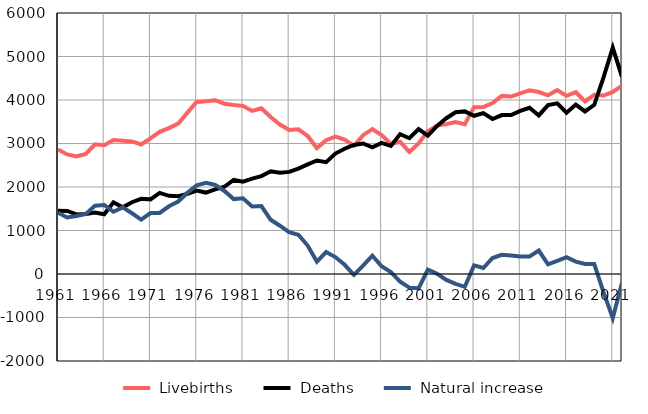
| Category |  Livebirths |  Deaths |  Natural increase |
|---|---|---|---|
| 1961.0 | 2860 | 1454 | 1406 |
| 1962.0 | 2748 | 1450 | 1298 |
| 1963.0 | 2704 | 1370 | 1334 |
| 1964.0 | 2762 | 1381 | 1381 |
| 1965.0 | 2983 | 1412 | 1571 |
| 1966.0 | 2961 | 1374 | 1587 |
| 1967.0 | 3079 | 1649 | 1430 |
| 1968.0 | 3063 | 1532 | 1531 |
| 1969.0 | 3047 | 1650 | 1397 |
| 1970.0 | 2978 | 1728 | 1250 |
| 1971.0 | 3118 | 1716 | 1402 |
| 1972.0 | 3269 | 1865 | 1404 |
| 1973.0 | 3353 | 1796 | 1557 |
| 1974.0 | 3456 | 1790 | 1666 |
| 1975.0 | 3710 | 1841 | 1869 |
| 1976.0 | 3953 | 1917 | 2036 |
| 1977.0 | 3969 | 1872 | 2097 |
| 1978.0 | 3996 | 1947 | 2049 |
| 1979.0 | 3915 | 2006 | 1909 |
| 1980.0 | 3884 | 2162 | 1722 |
| 1981.0 | 3865 | 2123 | 1742 |
| 1982.0 | 3748 | 2194 | 1554 |
| 1983.0 | 3811 | 2250 | 1561 |
| 1984.0 | 3609 | 2362 | 1247 |
| 1985.0 | 3436 | 2326 | 1110 |
| 1986.0 | 3311 | 2347 | 964 |
| 1987.0 | 3325 | 2424 | 901 |
| 1988.0 | 3173 | 2519 | 654 |
| 1989.0 | 2894 | 2609 | 285 |
| 1990.0 | 3076 | 2571 | 505 |
| 1991.0 | 3158 | 2769 | 389 |
| 1992.0 | 3090 | 2879 | 211 |
| 1993.0 | 2944 | 2966 | -22 |
| 1994.0 | 3192 | 3000 | 192 |
| 1995.0 | 3331 | 2910 | 421 |
| 1996.0 | 3192 | 3014 | 178 |
| 1997.0 | 2988 | 2943 | 45 |
| 1998.0 | 3041 | 3216 | -175 |
| 1999.0 | 2807 | 3121 | -314 |
| 2000.0 | 3000 | 3330 | -330 |
| 2001.0 | 3282 | 3180 | 102 |
| 2002.0 | 3411 | 3406 | 5 |
| 2003.0 | 3446 | 3581 | -135 |
| 2004.0 | 3493 | 3718 | -225 |
| 2005.0 | 3444 | 3738 | -294 |
| 2006.0 | 3836 | 3637 | 199 |
| 2007.0 | 3837 | 3699 | 138 |
| 2008.0 | 3930 | 3562 | 368 |
| 2009.0 | 4094 | 3653 | 441 |
| 2010.0 | 4080 | 3653 | 427 |
| 2011.0 | 4154 | 3750 | 404 |
| 2012.0 | 4225 | 3822 | 403 |
| 2013.0 | 4183 | 3645 | 538 |
| 2014.0 | 4108 | 3884 | 224 |
| 2015.0 | 4227 | 3924 | 303 |
| 2016.0 | 4095 | 3708 | 387 |
| 2017.0 | 4179 | 3895 | 284 |
| 2018.0 | 3966 | 3737 | 229 |
| 2019.0 | 4118 | 3889 | 229 |
| 2020.0 | 4103 | 4518 | -415 |
| 2021.0 | 4187 | 5203 | -1016 |
| 2022.0 | 4330 | 4531 | -201 |